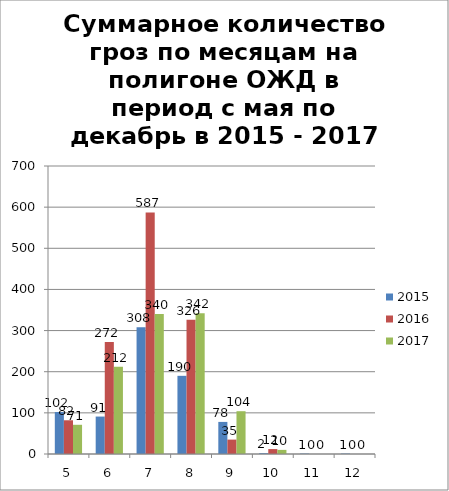
| Category | 2015 | 2016 | 2017 |
|---|---|---|---|
| 5.0 | 102 | 82 | 71 |
| 6.0 | 91 | 272 | 212 |
| 7.0 | 308 | 587 | 340 |
| 8.0 | 190 | 326 | 342 |
| 9.0 | 78 | 35 | 104 |
| 10.0 | 2 | 12 | 10 |
| 11.0 | 1 | 0 | 0 |
| 12.0 | 1 | 0 | 0 |